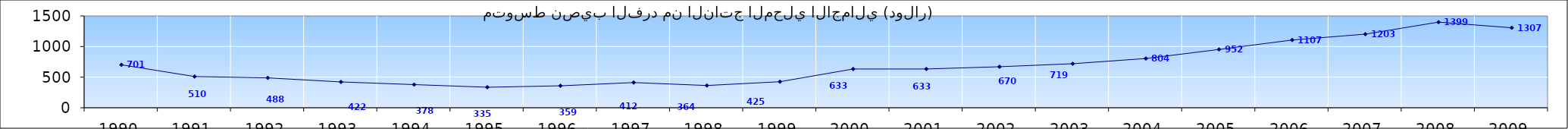
| Category | متوسط نصيب الفرد من الناتج المحلي الاجمالي (دولار) |
|---|---|
| 1990.0 | 701.42 |
| 1991.0 | 510.151 |
| 1992.0 | 488.229 |
| 1993.0 | 421.58 |
| 1994.0 | 378.102 |
| 1995.0 | 335.026 |
| 1996.0 | 358.523 |
| 1997.0 | 411.519 |
| 1998.0 | 363.553 |
| 1999.0 | 425.422 |
| 2000.0 | 633.014 |
| 2001.0 | 633.446 |
| 2002.0 | 669.845 |
| 2003.0 | 719.461 |
| 2004.0 | 804.383 |
| 2005.0 | 952.311 |
| 2006.0 | 1106.645 |
| 2007.0 | 1202.725 |
| 2008.0 | 1398.621 |
| 2009.0 | 1306.62 |